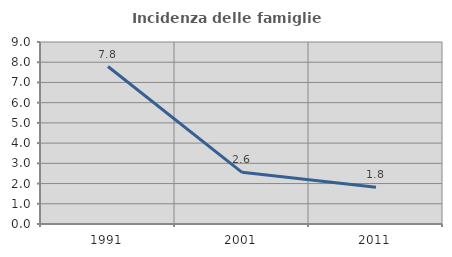
| Category | Incidenza delle famiglie numerose |
|---|---|
| 1991.0 | 7.787 |
| 2001.0 | 2.556 |
| 2011.0 | 1.815 |